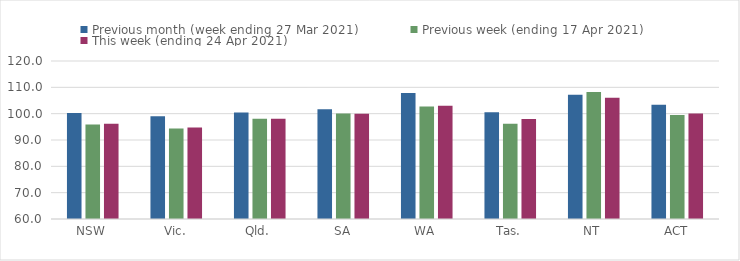
| Category | Previous month (week ending 27 Mar 2021) | Previous week (ending 17 Apr 2021) | This week (ending 24 Apr 2021) |
|---|---|---|---|
| NSW | 100.28 | 95.9 | 96.15 |
| Vic. | 98.99 | 94.32 | 94.74 |
| Qld. | 100.48 | 98.03 | 98.11 |
| SA | 101.71 | 100.07 | 99.98 |
| WA | 107.88 | 102.69 | 103.04 |
| Tas. | 100.57 | 96.18 | 97.95 |
| NT | 107.22 | 108.2 | 106.03 |
| ACT | 103.37 | 99.48 | 100.05 |